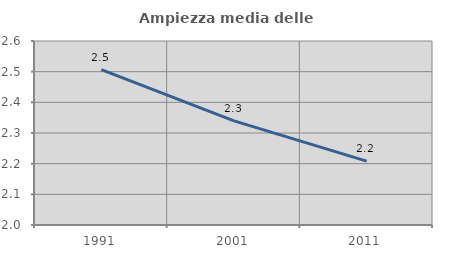
| Category | Ampiezza media delle famiglie |
|---|---|
| 1991.0 | 2.506 |
| 2001.0 | 2.339 |
| 2011.0 | 2.208 |